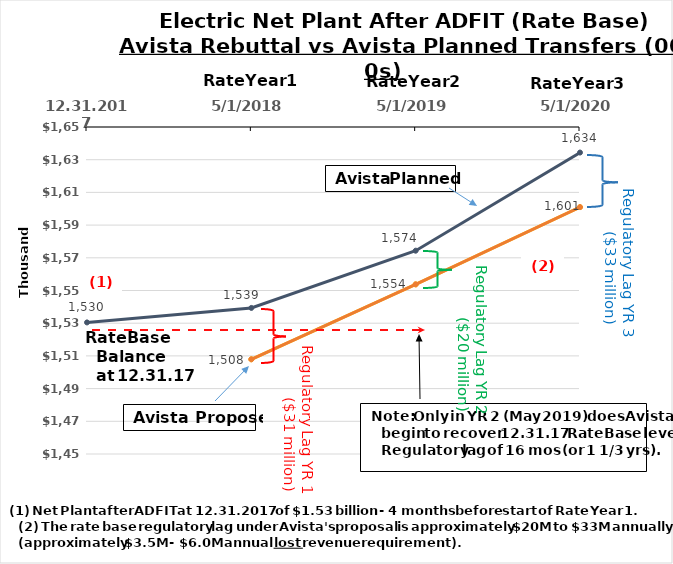
| Category | Avista Rebuttal | Avista Planned |
|---|---|---|
| 12.31.2017 | 1507919 | 1530469 |
| 5/1/2018 | 1507919 | 1539337 |
| 5/1/2019 | 1553759.738 | 1574348 |
| 5/1/2020 | 1600994.034 | 1634379 |